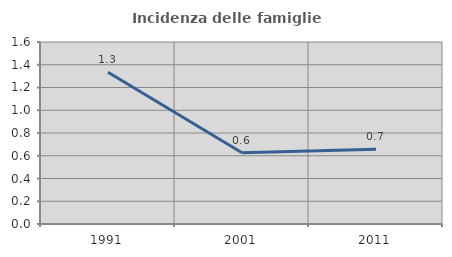
| Category | Incidenza delle famiglie numerose |
|---|---|
| 1991.0 | 1.335 |
| 2001.0 | 0.627 |
| 2011.0 | 0.657 |